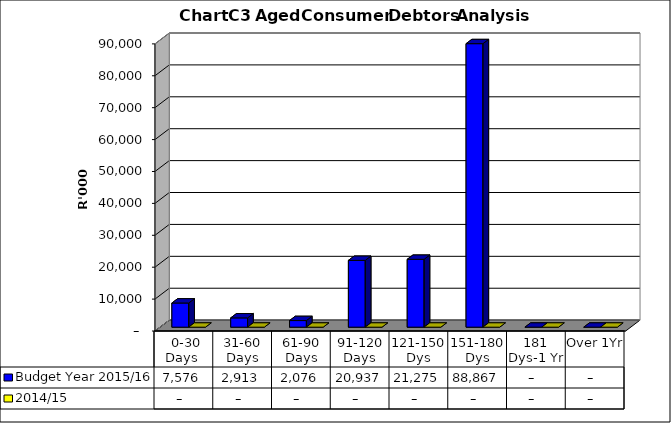
| Category | Budget Year 2015/16 | 2014/15 |
|---|---|---|
|  0-30 Days  | 7575575 | 0 |
| 31-60 Days | 2912637 | 0 |
| 61-90 Days | 2075737 | 0 |
| 91-120 Days | 20937356 | 0 |
| 121-150 Dys | 21275306 | 0 |
| 151-180 Dys | 88866548 | 0 |
| 181 Dys-1 Yr | 0 | 0 |
| Over 1Yr | 0 | 0 |